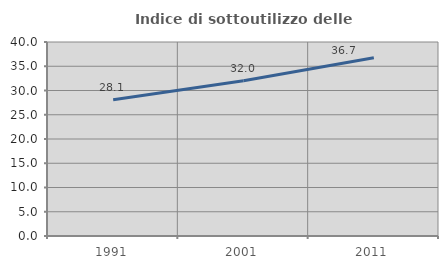
| Category | Indice di sottoutilizzo delle abitazioni  |
|---|---|
| 1991.0 | 28.111 |
| 2001.0 | 32.031 |
| 2011.0 | 36.735 |